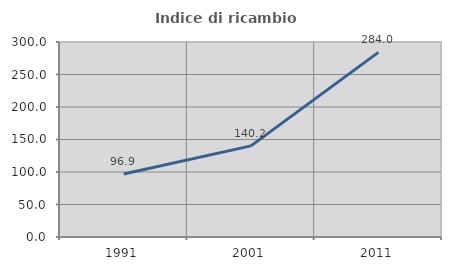
| Category | Indice di ricambio occupazionale  |
|---|---|
| 1991.0 | 96.923 |
| 2001.0 | 140.157 |
| 2011.0 | 283.978 |